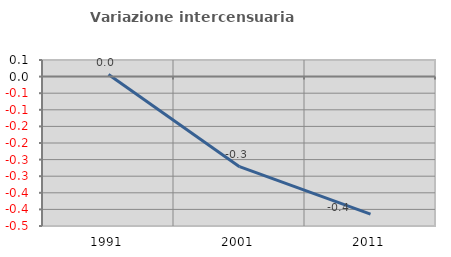
| Category | Variazione intercensuaria annua |
|---|---|
| 1991.0 | 0.006 |
| 2001.0 | -0.271 |
| 2011.0 | -0.414 |